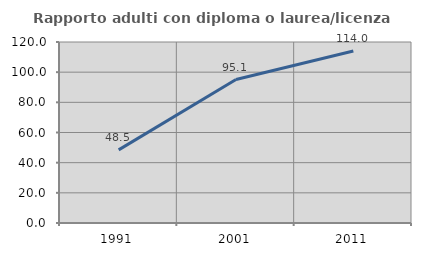
| Category | Rapporto adulti con diploma o laurea/licenza media  |
|---|---|
| 1991.0 | 48.466 |
| 2001.0 | 95.135 |
| 2011.0 | 114 |